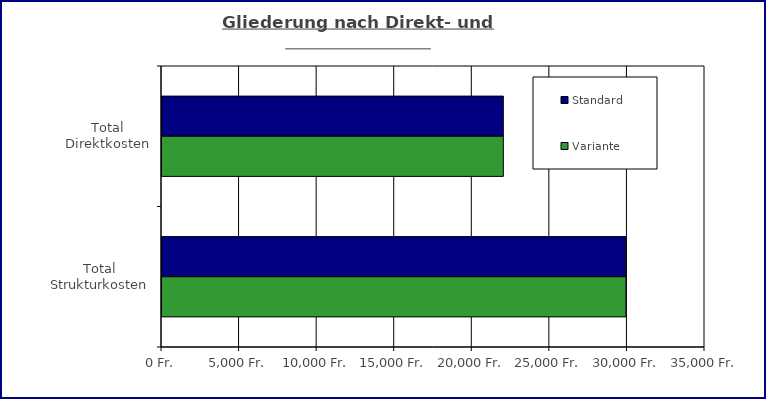
| Category | Standard | Variante  |
|---|---|---|
| Total Direktkosten | 22001.265 | 22001.291 |
| Total Strukturkosten | 29903.385 | 29903.388 |